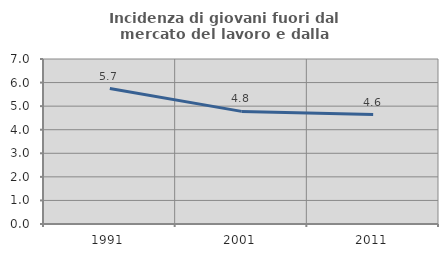
| Category | Incidenza di giovani fuori dal mercato del lavoro e dalla formazione  |
|---|---|
| 1991.0 | 5.748 |
| 2001.0 | 4.778 |
| 2011.0 | 4.643 |